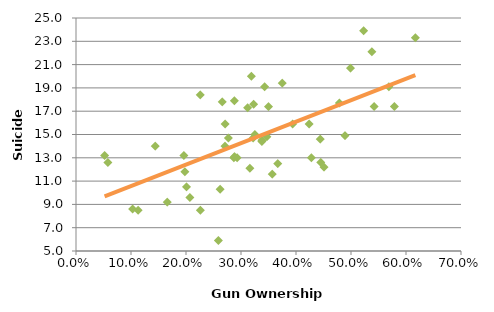
| Category | Series 0 |
|---|---|
| 0.489 | 14.9 |
| 0.617 | 23.3 |
| 0.323 | 17.6 |
| 0.579 | 17.4 |
| 0.201 | 10.5 |
| 0.343 | 19.1 |
| 0.166 | 9.2 |
| 0.052 | 13.2 |
| 0.259 | 5.9 |
| 0.325 | 15 |
| 0.316 | 12.1 |
| 0.451 | 12.2 |
| 0.569 | 19.1 |
| 0.262 | 10.3 |
| 0.338 | 14.4 |
| 0.338 | 14.5 |
| 0.322 | 14.7 |
| 0.424 | 15.9 |
| 0.445 | 12.6 |
| 0.226 | 18.4 |
| 0.207 | 9.6 |
| 0.226 | 8.5 |
| 0.288 | 13.1 |
| 0.367 | 12.5 |
| 0.428 | 13 |
| 0.271 | 15.9 |
| 0.523 | 23.9 |
| 0.198 | 11.8 |
| 0.375 | 19.4 |
| 0.144 | 14 |
| 0.113 | 8.5 |
| 0.499 | 20.7 |
| 0.103 | 8.6 |
| 0.287 | 13 |
| 0.479 | 17.7 |
| 0.196 | 13.2 |
| 0.312 | 17.3 |
| 0.266 | 17.8 |
| 0.271 | 14 |
| 0.058 | 12.6 |
| 0.444 | 14.6 |
| 0.35 | 17.4 |
| 0.394 | 15.9 |
| 0.357 | 11.6 |
| 0.319 | 20 |
| 0.288 | 17.9 |
| 0.293 | 13 |
| 0.277 | 14.7 |
| 0.542 | 17.4 |
| 0.347 | 14.8 |
| 0.538 | 22.1 |